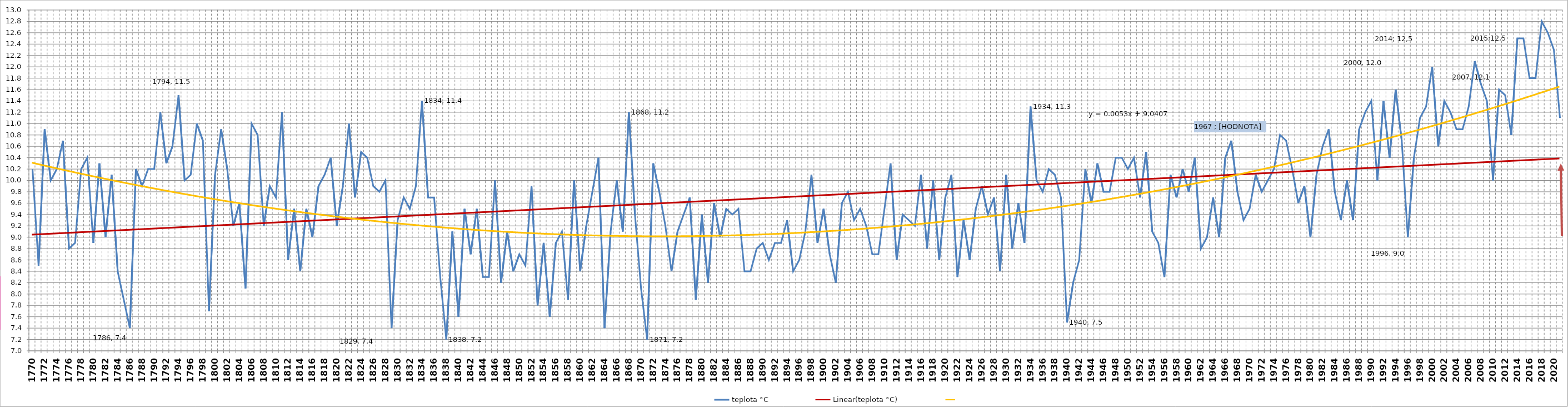
| Category | teplota °C |
|---|---|
| 1770 | 10.2 |
| 1771 | 8.5 |
| 1772 | 10.9 |
| 1773 | 10 |
| 1774 | 10.2 |
| 1775 | 10.7 |
| 1776 | 8.8 |
| 1777 | 8.9 |
| 1778 | 10.2 |
| 1779 | 10.4 |
| 1780 | 8.9 |
| 1781 | 10.3 |
| 1782 | 9 |
| 1783 | 10.1 |
| 1784 | 8.4 |
| 1785 | 7.9 |
| 1786 | 7.4 |
| 1787 | 10.2 |
| 1788 | 9.9 |
| 1789 | 10.2 |
| 1790 | 10.2 |
| 1791 | 11.2 |
| 1792 | 10.3 |
| 1793 | 10.6 |
| 1794 | 11.5 |
| 1795 | 10 |
| 1796 | 10.1 |
| 1797 | 11 |
| 1798 | 10.7 |
| 1799 | 7.7 |
| 1800 | 10.1 |
| 1801 | 10.9 |
| 1802 | 10.2 |
| 1803 | 9.2 |
| 1804 | 9.6 |
| 1805 | 8.1 |
| 1806 | 11 |
| 1807 | 10.8 |
| 1808 | 9.2 |
| 1809 | 9.9 |
| 1810 | 9.7 |
| 1811 | 11.2 |
| 1812 | 8.6 |
| 1813 | 9.5 |
| 1814 | 8.4 |
| 1815 | 9.5 |
| 1816 | 9 |
| 1817 | 9.9 |
| 1818 | 10.1 |
| 1819 | 10.4 |
| 1820 | 9.2 |
| 1821 | 9.9 |
| 1822 | 11 |
| 1823 | 9.7 |
| 1824 | 10.5 |
| 1825 | 10.4 |
| 1826 | 9.9 |
| 1827 | 9.8 |
| 1828 | 10 |
| 1829 | 7.4 |
| 1830 | 9.3 |
| 1831 | 9.7 |
| 1832 | 9.5 |
| 1833 | 9.9 |
| 1834 | 11.4 |
| 1835 | 9.7 |
| 1836 | 9.7 |
| 1837 | 8.3 |
| 1838 | 7.2 |
| 1839 | 9.1 |
| 1840 | 7.6 |
| 1841 | 9.5 |
| 1842 | 8.7 |
| 1843 | 9.5 |
| 1844 | 8.3 |
| 1845 | 8.3 |
| 1846 | 10 |
| 1847 | 8.2 |
| 1848 | 9.1 |
| 1849 | 8.4 |
| 1850 | 8.7 |
| 1851 | 8.5 |
| 1852 | 9.9 |
| 1853 | 7.8 |
| 1854 | 8.9 |
| 1855 | 7.6 |
| 1856 | 8.9 |
| 1857 | 9.1 |
| 1858 | 7.9 |
| 1859 | 10 |
| 1860 | 8.4 |
| 1861 | 9.2 |
| 1862 | 9.8 |
| 1863 | 10.4 |
| 1864 | 7.4 |
| 1865 | 9.1 |
| 1866 | 10 |
| 1867 | 9.1 |
| 1868 | 11.2 |
| 1869 | 9.4 |
| 1870 | 8.1 |
| 1871 | 7.2 |
| 1872 | 10.3 |
| 1873 | 9.8 |
| 1874 | 9.2 |
| 1875 | 8.4 |
| 1876 | 9.1 |
| 1877 | 9.4 |
| 1878 | 9.7 |
| 1879 | 7.9 |
| 1880 | 9.4 |
| 1881 | 8.2 |
| 1882 | 9.6 |
| 1883 | 9 |
| 1884 | 9.5 |
| 1885 | 9.4 |
| 1886 | 9.5 |
| 1887 | 8.4 |
| 1888 | 8.4 |
| 1889 | 8.8 |
| 1890 | 8.9 |
| 1891 | 8.6 |
| 1892 | 8.9 |
| 1893 | 8.9 |
| 1894 | 9.3 |
| 1895 | 8.4 |
| 1896 | 8.6 |
| 1897 | 9.1 |
| 1898 | 10.1 |
| 1899 | 8.9 |
| 1900 | 9.5 |
| 1901 | 8.7 |
| 1902 | 8.2 |
| 1903 | 9.6 |
| 1904 | 9.8 |
| 1905 | 9.3 |
| 1906 | 9.5 |
| 1907 | 9.2 |
| 1908 | 8.7 |
| 1909 | 8.7 |
| 1910 | 9.5 |
| 1911 | 10.3 |
| 1912 | 8.6 |
| 1913 | 9.4 |
| 1914 | 9.3 |
| 1915 | 9.2 |
| 1916 | 10.1 |
| 1917 | 8.8 |
| 1918 | 10 |
| 1919 | 8.6 |
| 1920 | 9.7 |
| 1921 | 10.1 |
| 1922 | 8.3 |
| 1923 | 9.3 |
| 1924 | 8.6 |
| 1925 | 9.5 |
| 1926 | 9.9 |
| 1927 | 9.4 |
| 1928 | 9.7 |
| 1929 | 8.4 |
| 1930 | 10.1 |
| 1931 | 8.8 |
| 1932 | 9.6 |
| 1933 | 8.9 |
| 1934 | 11.3 |
| 1935 | 10 |
| 1936 | 9.8 |
| 1937 | 10.2 |
| 1938 | 10.1 |
| 1939 | 9.7 |
| 1940 | 7.5 |
| 1941 | 8.2 |
| 1942 | 8.6 |
| 1943 | 10.2 |
| 1944 | 9.6 |
| 1945 | 10.3 |
| 1946 | 9.8 |
| 1947 | 9.8 |
| 1948 | 10.4 |
| 1949 | 10.4 |
| 1950 | 10.2 |
| 1951 | 10.4 |
| 1952 | 9.7 |
| 1953 | 10.5 |
| 1954 | 9.1 |
| 1955 | 8.9 |
| 1956 | 8.3 |
| 1957 | 10.1 |
| 1958 | 9.7 |
| 1959 | 10.2 |
| 1960 | 9.8 |
| 1961 | 10.4 |
| 1962 | 8.8 |
| 1963 | 9 |
| 1964 | 9.7 |
| 1965 | 9 |
| 1966 | 10.4 |
| 1967 | 10.7 |
| 1968 | 9.8 |
| 1969 | 9.3 |
| 1970 | 9.5 |
| 1971 | 10.1 |
| 1972 | 9.8 |
| 1973 | 10 |
| 1974 | 10.2 |
| 1975 | 10.8 |
| 1976 | 10.7 |
| 1977 | 10.2 |
| 1978 | 9.6 |
| 1979 | 9.9 |
| 1980 | 9 |
| 1981 | 10.1 |
| 1982 | 10.6 |
| 1983 | 10.9 |
| 1984 | 9.8 |
| 1985 | 9.3 |
| 1986 | 10 |
| 1987 | 9.3 |
| 1988 | 10.9 |
| 1989 | 11.2 |
| 1990 | 11.4 |
| 1991 | 10 |
| 1992 | 11.4 |
| 1993 | 10.4 |
| 1994 | 11.6 |
| 1995 | 10.7 |
| 1996 | 9 |
| 1997 | 10.4 |
| 1998 | 11.1 |
| 1999 | 11.3 |
| 2000 | 12 |
| 2001 | 10.6 |
| 2002 | 11.4 |
| 2003 | 11.2 |
| 2004 | 10.9 |
| 2005 | 10.9 |
| 2006 | 11.3 |
| 2007 | 12.1 |
| 2008 | 11.7 |
| 2009 | 11.4 |
| 2010 | 10 |
| 2011 | 11.6 |
| 2012 | 11.5 |
| 2013 | 10.8 |
| 2014 | 12.5 |
| 2015 | 12.5 |
| 2016 | 11.8 |
| 2017 | 11.8 |
| 2018 | 12.8 |
| 2019 | 12.6 |
| 2020 | 12.3 |
| 2021 | 11.1 |